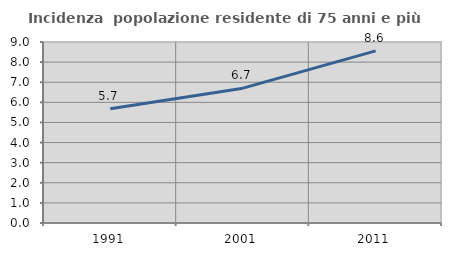
| Category | Incidenza  popolazione residente di 75 anni e più |
|---|---|
| 1991.0 | 5.677 |
| 2001.0 | 6.705 |
| 2011.0 | 8.561 |